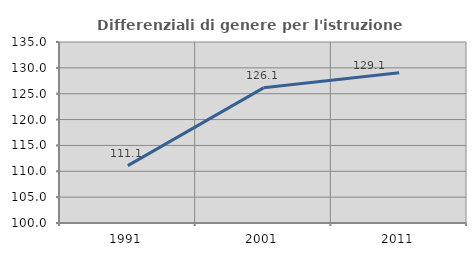
| Category | Differenziali di genere per l'istruzione superiore |
|---|---|
| 1991.0 | 111.095 |
| 2001.0 | 126.139 |
| 2011.0 | 129.058 |